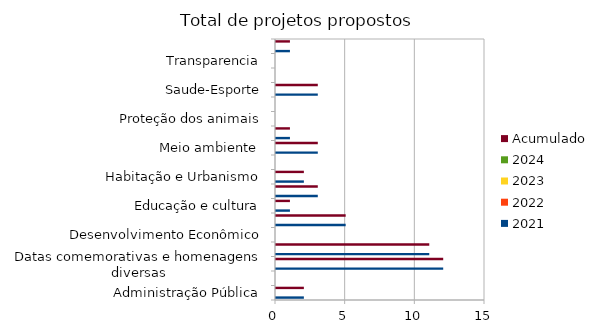
| Category | 2021 | 2022 | 2023 | 2024 | Acumulado |
|---|---|---|---|---|---|
| Administração Pública | 2 |  |  |  | 2 |
| Combate à corrupção  | 0 |  |  |  | 0 |
| Datas comemorativas e homenagens diversas | 12 |  |  |  | 12 |
| Denominação de logradouro | 11 |  |  |  | 11 |
| Desenvolvimento Econômico | 0 |  |  |  | 0 |
| Desenvolvimento Social  | 5 |  |  |  | 5 |
| Educação e cultura | 1 |  |  |  | 1 |
| Frente parlamentar | 3 |  |  |  | 3 |
| Habitação e Urbanismo | 2 |  |  |  | 2 |
| Lei Orgânica do Município | 0 |  |  |  | 0 |
| Meio ambiente  | 3 |  |  |  | 3 |
| Mobilidade | 1 |  |  |  | 1 |
| Proteção dos animais | 0 |  |  |  | 0 |
| Regimento Interno da CMSP | 0 |  |  |  | 0 |
| Saude-Esporte | 3 |  |  |  | 3 |
| Segurança Pública | 0 |  |  |  | 0 |
| Transparencia | 0 |  |  |  | 0 |
| Tributação | 1 |  |  |  | 1 |